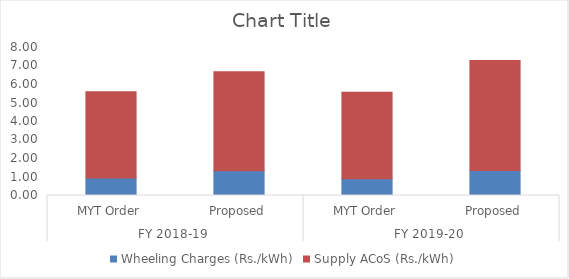
| Category | Wheeling Charges (Rs./kWh) | Supply ACoS (Rs./kWh) |
|---|---|---|
| 0 | 0.944 | 4.658 |
| 1 | 1.339 | 5.346 |
| 2 | 0.911 | 4.675 |
| 3 | 1.357 | 5.94 |